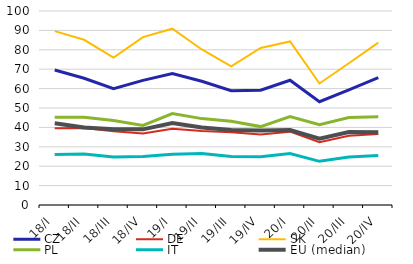
| Category | CZ | DE | SK | PL | IT | EU (median) |
|---|---|---|---|---|---|---|
| 18/I | 69.557 | 39.616 | 89.63 | 45.257 | 26.003 | 42.141 |
| 18/II | 65.349 | 39.654 | 85.163 | 45.185 | 26.247 | 39.999 |
| 18/III | 59.933 | 38.025 | 75.967 | 43.51 | 24.761 | 39.074 |
| 18/IV | 64.241 | 36.875 | 86.533 | 41.024 | 24.942 | 38.994 |
| 19/I | 67.802 | 39.333 | 90.884 | 47.147 | 26.134 | 42.242 |
| 19/II | 63.794 | 38.184 | 80.169 | 44.528 | 26.588 | 39.998 |
| 19/III | 58.928 | 37.517 | 71.521 | 43.207 | 24.989 | 38.686 |
| 19/IV | 59.157 | 36.355 | 80.93 | 40.422 | 24.87 | 38.459 |
| 20/I | 64.312 | 37.801 | 84.321 | 45.609 | 26.482 | 38.629 |
| 20/II | 53.254 | 32.347 | 62.644 | 41.447 | 22.509 | 34.192 |
| 20/III | 59.399 | 35.651 | 73.075 | 45.136 | 24.794 | 37.59 |
| 20/IV | 65.664 | 36.583 | 83.676 | 45.522 | 25.535 | 37.444 |